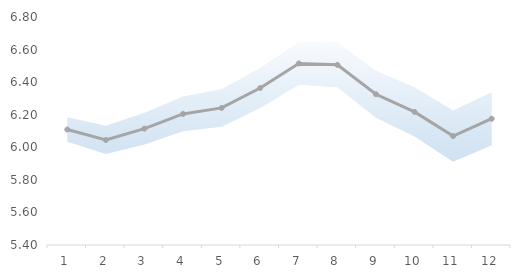
| Category | Series 2 |
|---|---|
| 0 | 6.109 |
| 1 | 6.045 |
| 2 | 6.114 |
| 3 | 6.205 |
| 4 | 6.242 |
| 5 | 6.364 |
| 6 | 6.515 |
| 7 | 6.506 |
| 8 | 6.326 |
| 9 | 6.217 |
| 10 | 6.069 |
| 11 | 6.175 |